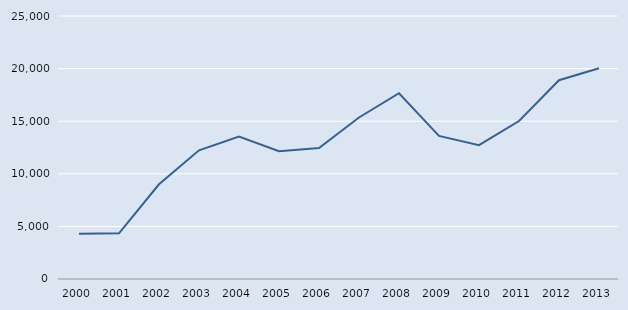
| Category | Series 0 |
|---|---|
| 2000.0 | 4311 |
| 2001.0 | 4347 |
| 2002.0 | 9005 |
| 2003.0 | 12228 |
| 2004.0 | 13539 |
| 2005.0 | 12138 |
| 2006.0 | 12441 |
| 2007.0 | 15351 |
| 2008.0 | 17657 |
| 2009.0 | 13601 |
| 2010.0 | 12720 |
| 2011.0 | 15020 |
| 2012.0 | 18892 |
| 2013.0 | 20039 |